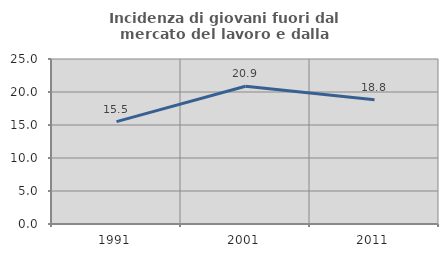
| Category | Incidenza di giovani fuori dal mercato del lavoro e dalla formazione  |
|---|---|
| 1991.0 | 15.512 |
| 2001.0 | 20.879 |
| 2011.0 | 18.843 |